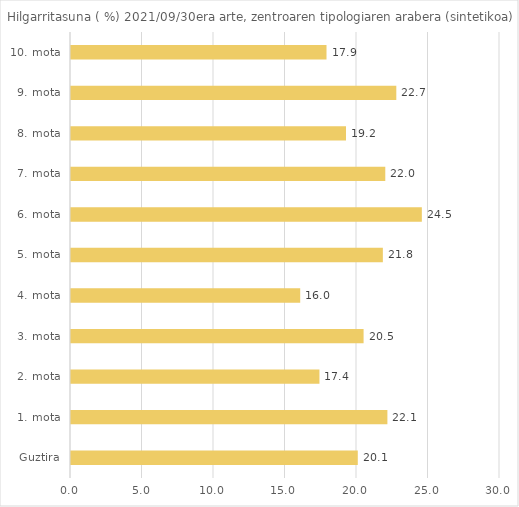
| Category | Series 0 |
|---|---|
| Guztira | 20.055 |
| 1. mota | 22.126 |
| 2. mota | 17.374 |
| 3. mota | 20.461 |
| 4. mota | 16.029 |
| 5. mota | 21.809 |
| 6. mota | 24.534 |
| 7. mota | 21.978 |
| 8. mota | 19.231 |
| 9. mota | 22.749 |
| 10. mota | 17.867 |